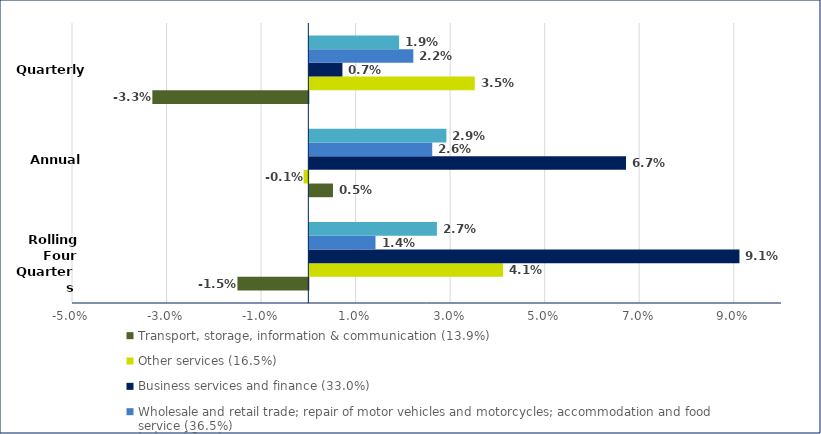
| Category | Transport, storage, information & communication (13.9%) | Other services (16.5%) | Business services and finance (33.0%) | Wholesale and retail trade; repair of motor vehicles and motorcycles; accommodation and food service (36.5%) | Index of Services |
|---|---|---|---|---|---|
|  | -0.015 | 0.041 | 0.091 | 0.014 | 0.027 |
|  | 0.005 | -0.001 | 0.067 | 0.026 | 0.029 |
|  | -0.033 | 0.035 | 0.007 | 0.022 | 0.019 |